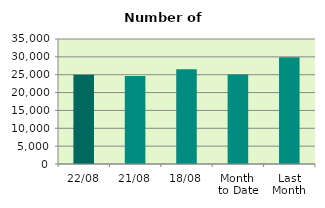
| Category | Series 0 |
|---|---|
| 22/08 | 24956 |
| 21/08 | 24610 |
| 18/08 | 26524 |
| Month 
to Date | 25049.5 |
| Last
Month | 29864.476 |